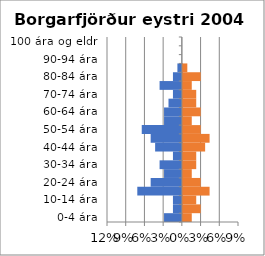
| Category | % karlar | %konur |
|---|---|---|
| 0-4 ára | -0.029 | 0.014 |
| 5-9 ára | -0.014 | 0.029 |
| 10-14 ára | -0.014 | 0.021 |
| 15-19 ára | -0.071 | 0.043 |
| 20-24 ára | -0.05 | 0.029 |
| 25-29 ára | -0.029 | 0.014 |
| 30-34 ára | -0.036 | 0.021 |
| 35-39 ára | -0.014 | 0.021 |
| 40-44 ára | -0.043 | 0.036 |
| 45-49 ára | -0.05 | 0.043 |
| 50-54 ára | -0.064 | 0.029 |
| 55-59 ára | -0.029 | 0.014 |
| 60-64 ára | -0.029 | 0.029 |
| 65-69 ára | -0.021 | 0.021 |
| 70-74 ára | -0.014 | 0.021 |
| 75-79 ára | -0.036 | 0.014 |
| 80-84 ára | -0.014 | 0.029 |
| 85-89 ára | -0.007 | 0.007 |
| 90-94 ára | 0 | 0 |
| 95-99 ára | 0 | 0 |
| 100 ára og eldri | 0 | 0 |